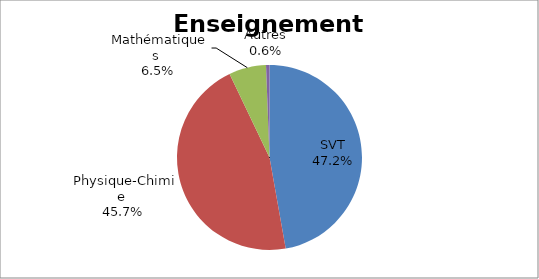
| Category | Enseignement scientifique |
|---|---|
| SVT | 0.472 |
| Physique-Chimie | 0.457 |
| Mathématiques | 0.065 |
| Autres | 0.006 |